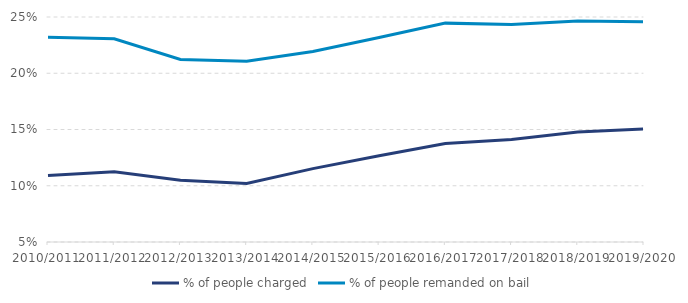
| Category | % of people charged | % of people remanded on bail |
|---|---|---|
| 2010/2011 | 0.109 | 0.232 |
| 2011/2012 | 0.112 | 0.231 |
| 2012/2013 | 0.105 | 0.212 |
| 2013/2014 | 0.102 | 0.211 |
| 2014/2015 | 0.115 | 0.219 |
| 2015/2016 | 0.127 | 0.232 |
| 2016/2017 | 0.138 | 0.245 |
| 2017/2018 | 0.141 | 0.243 |
| 2018/2019 | 0.148 | 0.247 |
| 2019/2020 | 0.151 | 0.246 |